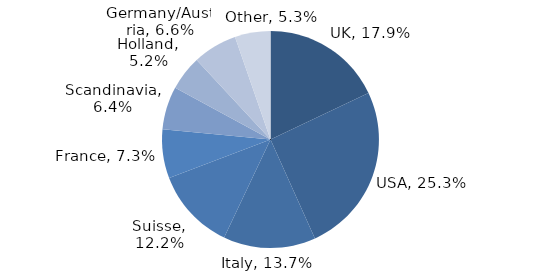
| Category | Investment Style |
|---|---|
| UK | 0.179 |
| USA | 0.253 |
| Italy | 0.137 |
| Suisse | 0.122 |
| France | 0.073 |
| Scandinavia | 0.064 |
| Holland | 0.052 |
| Germany/Austria | 0.066 |
| Other | 0.053 |